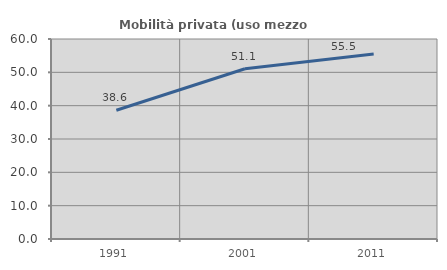
| Category | Mobilità privata (uso mezzo privato) |
|---|---|
| 1991.0 | 38.618 |
| 2001.0 | 51.089 |
| 2011.0 | 55.508 |